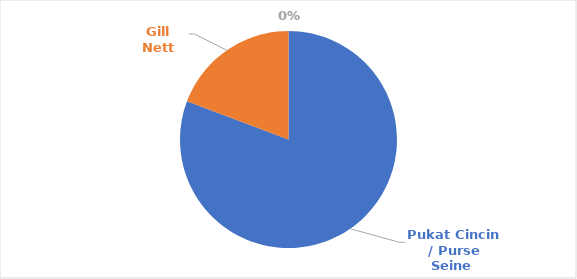
| Category | Series 0 |
|---|---|
| Pukat Cincin / Purse Seine  | 239 |
| Gill Nett | 57 |